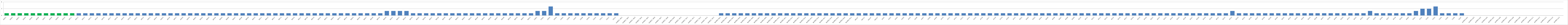
| Category | Series 0 |
|---|---|
| AW01 | 1 |
| AW02 | 1 |
| AW03 | 1 |
| AW04 | 1 |
| AW05 | 1 |
| AW06 | 1 |
| AW07 | 1 |
| AW08 | 1 |
| AW09 | 1 |
| AW10 | 1 |
| AW11 | 1 |
| AW12 | 1 |
| AW13 | 1 |
| AW14 | 1 |
| AW15 | 1 |
| AW16 | 1 |
| AW17 | 1 |
| AW18 | 1 |
| AW19 | 1 |
| AW20 | 1 |
| AW21 | 1 |
| AW22 | 1 |
| AW23 | 1 |
| AW24 | 1 |
| AW25 | 1 |
| AW26 | 1 |
| AW27 | 1 |
| AW28 | 1 |
| AW29 | 1 |
| BW01 | 1 |
| BW02 | 1 |
| BW03 | 1 |
| BWO4 | 1 |
| BW05 | 1 |
| BW06 | 1 |
| BW07 | 1 |
| BW08 | 1 |
| BW09 | 1 |
| BW10 | 1 |
| BW11 | 1 |
| BW12 | 1 |
| BW13 | 1 |
| BW14 | 1 |
| BW15 | 1 |
| BW16 | 1 |
| BW17 | 1 |
| BW18 | 1 |
| BW19 | 1 |
| BW20 | 1 |
| BW21 | 1 |
| BW22 | 1 |
| BW23 | 1 |
| BW24 | 1 |
| BW25 | 1 |
| BW26 | 1 |
| BW27 | 1 |
| BW28 | 1 |
| BW29 | 1 |
| BW30 | 2 |
| BW31 | 2 |
| BW32 | 2 |
| BW33 | 2 |
| BW34 | 1 |
| BW35 | 1 |
| BW36 | 1 |
| BW37 | 1 |
| BW38 | 1 |
| BW39 | 1 |
| BW40 | 1 |
| BW41 | 1 |
| BW42 | 1 |
| BW43 | 1 |
| BW44 | 1 |
| BW45 | 1 |
| BW46 | 1 |
| BW47 | 1 |
| BW48 | 1 |
| BW49 | 1 |
| BW50 | 1 |
| BW51 | 1 |
| BW52 | 1 |
| CW01 | 2 |
| CW02 | 2 |
| CW03 | 4 |
| CW04 | 1 |
| CW05 | 1 |
| CW06 | 1 |
| CW07 | 1 |
| CW08 | 1 |
| CW09 | 1 |
| CW10 | 1 |
| CW11 | 1 |
| CW12 | 1 |
| CW13 | 1 |
| AUMED. W01 | 0 |
| AUMED. W02 | 0 |
| AUMED. W03 | 0 |
| AUMED. W04 | 0 |
| AUMED. W05 | 0 |
| AUMED. W06 | 0 |
| AUMED. W07 | 0 |
| AUMED. W08 | 0 |
| AUMED.W09 | 0 |
| AUMED. W10 | 0 |
| AUMED. W11 | 0 |
| AUMED. W12 | 0 |
| AUMED. W13 | 0 |
| AUMED. W14 | 0 |
| AUMED. W15 | 0 |
| BUMED.W01 | 1 |
| BUMED.W02 | 1 |
| BUMED.W03 | 1 |
| BUMED.W04 | 1 |
| BUMED.W05 | 1 |
| BUMED.W06 | 1 |
| BUMED.W07 | 1 |
| BUMED.W08 | 1 |
| BUMED.W09 | 1 |
| BUMED.W10 | 1 |
| BUMED.W11 | 1 |
| BUMED.W12 | 1 |
| BUMED.W13 | 1 |
| BUMED.W14 | 1 |
| BUMED.W15 | 1 |
| BUMED.W16 | 1 |
| BUMED.W17 | 1 |
| BUMED.W18 | 1 |
| BUMED.W19 | 1 |
| BUMED.W20 | 1 |
| BUMED.W21 | 1 |
| AW22* | 1 |
| AW23* | 1 |
| AW24* | 1 |
| AW25* | 1 |
| AU01 | 1 |
| AU02 | 1 |
| AU03 | 1 |
| AU04 | 1 |
| AU05 | 1 |
| AU06 | 1 |
| AU07 | 1 |
| AU08 | 1 |
| AU09 | 1 |
| AU10 | 1 |
| AU11 | 1 |
| AU12 | 1 |
| AU13 | 1 |
| AU14 | 1 |
| AU15 | 1 |
| AU16 | 1 |
| AU17 | 1 |
| AU18 | 1 |
| AU19 | 1 |
| AU20 | 1 |
| AU21 | 1 |
| BU01 | 1 |
| BU02 | 1 |
| BU03 | 1 |
| BU04 | 1 |
| BU05 | 1 |
| BU06 | 1 |
| BU07 | 1 |
| BU08 | 1 |
| BU09 | 1 |
| BU10 | 1 |
| BU11 | 1 |
| BU12 | 1 |
| BU13 | 1 |
| BU14 | 1 |
| BU15 | 1 |
| BU16 | 1 |
| BU17 | 1 |
| BU18 | 1 |
| BU19 | 1 |
| BU20 | 1 |
| BU21 | 1 |
| BU22 | 1 |
| BU23 | 1 |
| BU24 | 1 |
| BU25 | 1 |
| BU26 | 1 |
| BU27 | 1 |
| BU28 | 1 |
| BU29 | 1 |
| BU30 | 1 |
| BU31 | 1 |
| BU32 | 1 |
| BU33 | 2 |
| BU34 | 1 |
| BU35 | 1 |
| BU36 | 1 |
| BU37 | 1 |
| BU38 | 1 |
| BU39 | 1 |
| BU40 | 1 |
| BU41 | 1 |
| BU42 | 1 |
| BU43 | 1 |
| BU44 | 1 |
| BU45 | 1 |
| BU46 | 1 |
| BU47 | 1 |
| BU48 | 1 |
| BU49 | 1 |
| BU50 | 1 |
| BU51 | 1 |
| BU52 | 1 |
| BU53 | 1 |
| BU54 | 2 |
| BU55 | 1 |
| BU56 | 1 |
| BU57 | 1 |
| BU58 | 1 |
| BU59 | 1 |
| BU60 | 1 |
| BU61 | 2 |
| CU01 | 3 |
| CU02 | 3 |
| CU03 | 4 |
| CU04 | 1 |
| CU05 | 1 |
| CU06 | 1 |
| CU07 | 1 |
| AUMED.U01 | 0 |
| AUMED.U02 | 0 |
| AUMED.U03 | 0 |
| AUMED.U04 | 0 |
| AUMED.U05 | 0 |
| AUMED.U06 | 0 |
| AUMED.U07 | 0 |
| AUMED.U08 | 0 |
| AUMED.U09 | 0 |
| AUMED.U10 | 0 |
| AUMED.U11 | 0 |
| AUMED.U12 | 0 |
| AUMED.U13 | 0 |
| AUMED.U14 | 0 |
| AUMED.U15 | 0 |